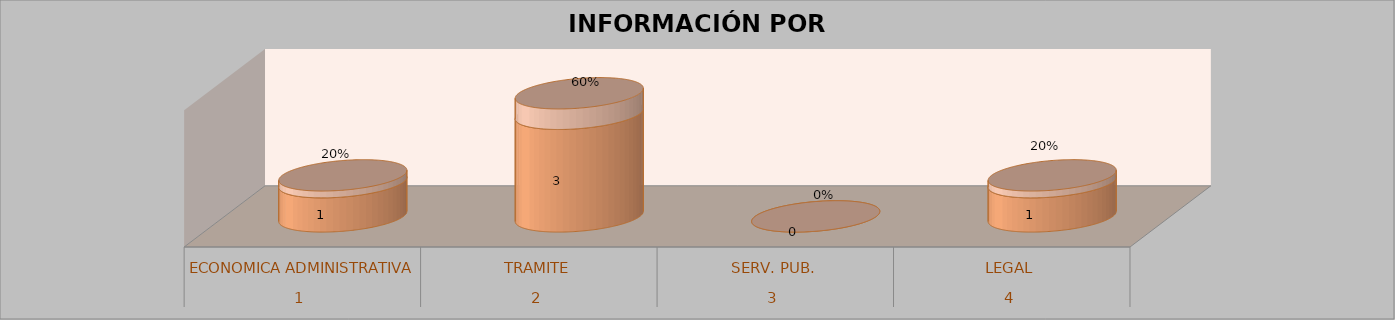
| Category | Series 0 | Series 1 | Series 2 | Series 3 |
|---|---|---|---|---|
| 0 |  |  | 1 | 0.2 |
| 1 |  |  | 3 | 0.6 |
| 2 |  |  | 0 | 0 |
| 3 |  |  | 1 | 0.2 |